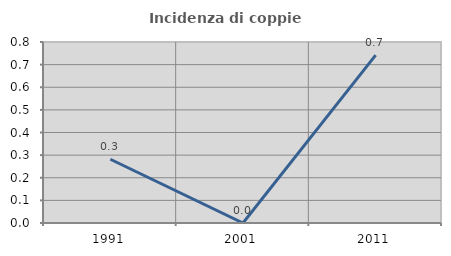
| Category | Incidenza di coppie miste |
|---|---|
| 1991.0 | 0.282 |
| 2001.0 | 0 |
| 2011.0 | 0.742 |